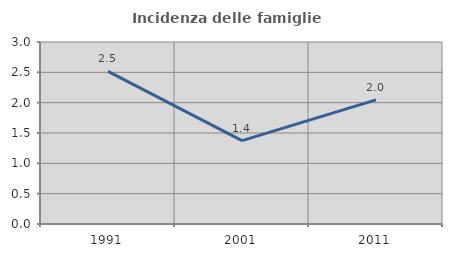
| Category | Incidenza delle famiglie numerose |
|---|---|
| 1991.0 | 2.515 |
| 2001.0 | 1.375 |
| 2011.0 | 2.047 |